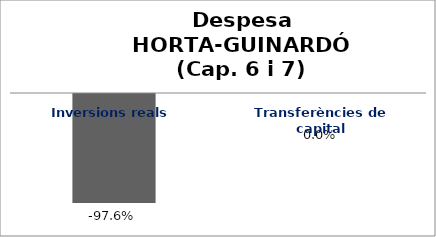
| Category | Series 0 |
|---|---|
| Inversions reals | -0.976 |
| Transferències de capital | 0 |